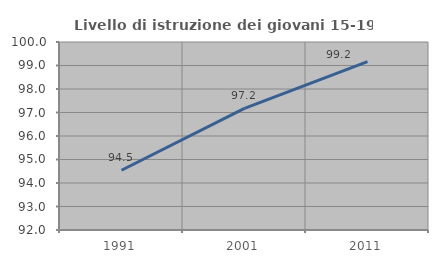
| Category | Livello di istruzione dei giovani 15-19 anni |
|---|---|
| 1991.0 | 94.544 |
| 2001.0 | 97.174 |
| 2011.0 | 99.167 |